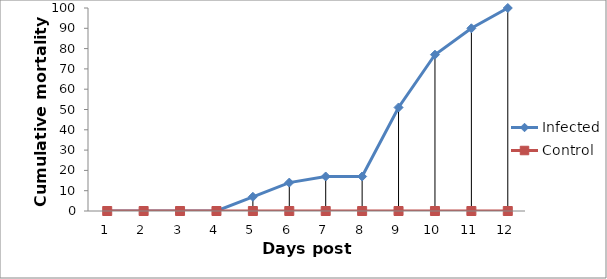
| Category | Infected  | Control   |
|---|---|---|
| 0 | 0 | 0 |
| 1 | 0 | 0 |
| 2 | 0 | 0 |
| 3 | 0 | 0 |
| 4 | 7 | 0 |
| 5 | 14 | 0 |
| 6 | 17 | 0 |
| 7 | 17 | 0 |
| 8 | 51 | 0 |
| 9 | 77 | 0 |
| 10 | 90 | 0 |
| 11 | 100 | 0 |